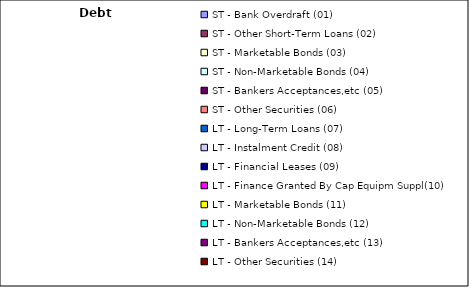
| Category | Debt Type |
|---|---|
| ST - Bank Overdraft (01) | 0 |
| ST - Other Short-Term Loans (02) | 0 |
| ST - Marketable Bonds (03) | 0 |
| ST - Non-Marketable Bonds (04) | 0 |
| ST - Bankers Acceptances,etc (05) | 0 |
| ST - Other Securities (06) | 0 |
| LT - Long-Term Loans (07) | 0 |
| LT - Instalment Credit (08) | 0 |
| LT - Financial Leases (09) | 0 |
| LT - Finance Granted By Cap Equipm Suppl(10) | 0 |
| LT - Marketable Bonds (11) | 0 |
| LT - Non-Marketable Bonds (12) | 0 |
| LT - Bankers Acceptances,etc (13) | 0 |
| LT - Other Securities (14) | 0 |